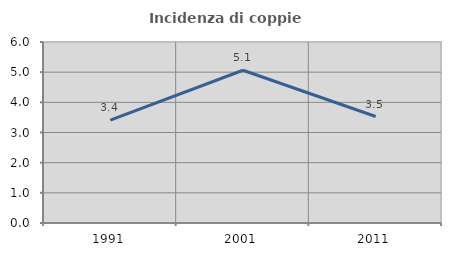
| Category | Incidenza di coppie miste |
|---|---|
| 1991.0 | 3.409 |
| 2001.0 | 5.063 |
| 2011.0 | 3.529 |